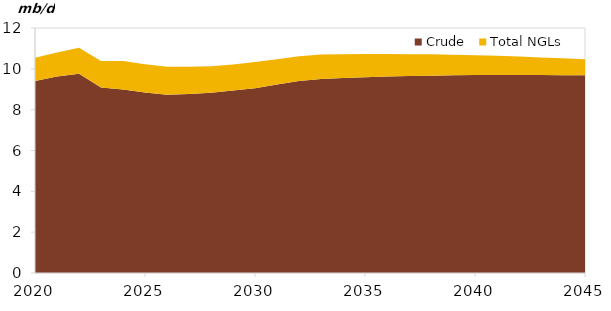
| Category | Crude | Total NGLs |
|---|---|---|
| 2020-01-01 | 9.409 | 1.132 |
| 2021-01-01 | 9.619 | 1.181 |
| 2022-01-01 | 9.756 | 1.277 |
| 2023-01-01 | 9.084 | 1.297 |
| 2024-01-01 | 8.983 | 1.397 |
| 2025-01-01 | 8.837 | 1.388 |
| 2026-01-01 | 8.729 | 1.369 |
| 2027-01-01 | 8.773 | 1.325 |
| 2028-01-01 | 8.827 | 1.3 |
| 2029-01-01 | 8.937 | 1.276 |
| 2030-01-01 | 9.053 | 1.279 |
| 2031-01-01 | 9.228 | 1.247 |
| 2032-01-01 | 9.4 | 1.222 |
| 2033-01-01 | 9.502 | 1.195 |
| 2034-01-01 | 9.547 | 1.167 |
| 2035-01-01 | 9.586 | 1.137 |
| 2036-01-01 | 9.619 | 1.106 |
| 2037-01-01 | 9.646 | 1.075 |
| 2038-01-01 | 9.667 | 1.042 |
| 2039-01-01 | 9.683 | 1.007 |
| 2040-01-01 | 9.694 | 0.972 |
| 2041-01-01 | 9.7 | 0.936 |
| 2042-01-01 | 9.702 | 0.9 |
| 2043-01-01 | 9.699 | 0.862 |
| 2044-01-01 | 9.692 | 0.823 |
| 2045-01-01 | 9.68 | 0.784 |